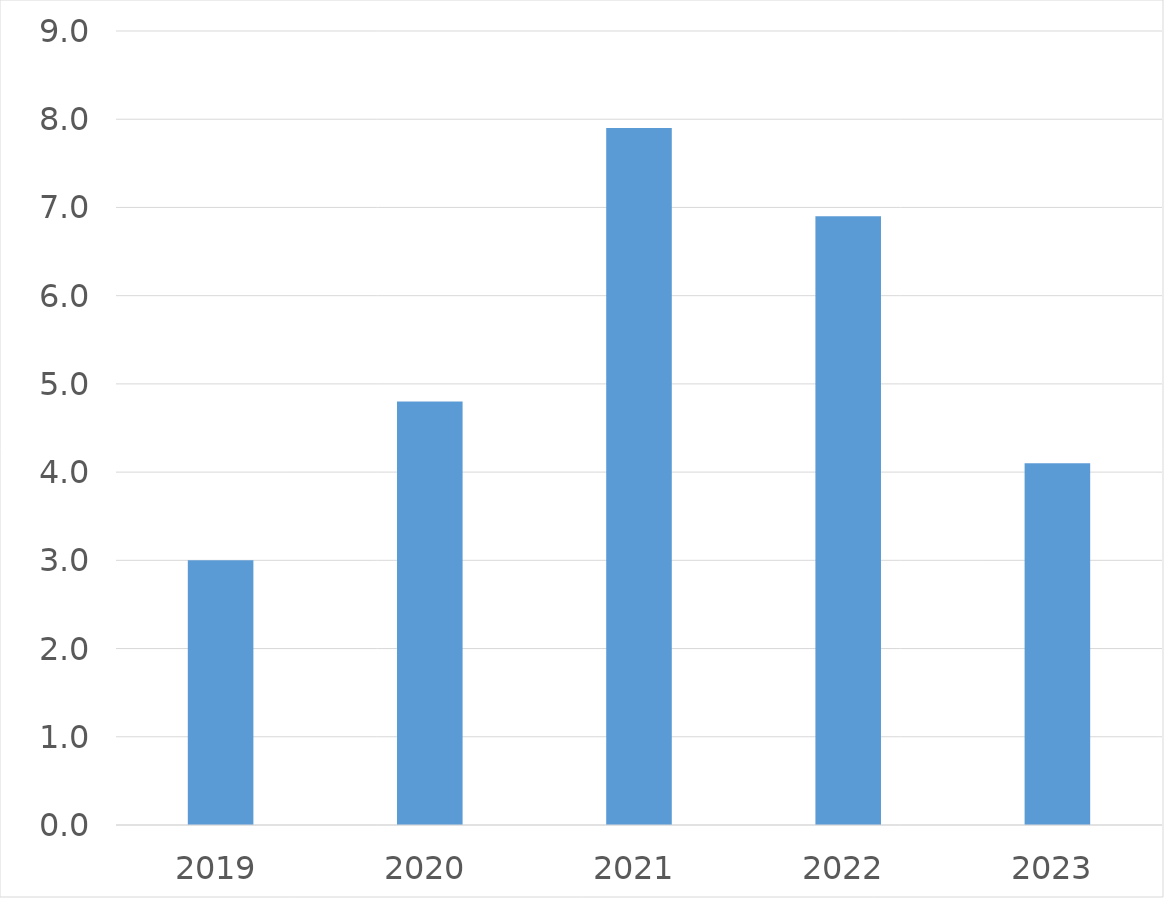
| Category | Series 0 |
|---|---|
| 2019 | 3 |
| 2020 | 4.8 |
| 2021 | 7.9 |
| 2022 | 6.9 |
| 2023 | 4.1 |